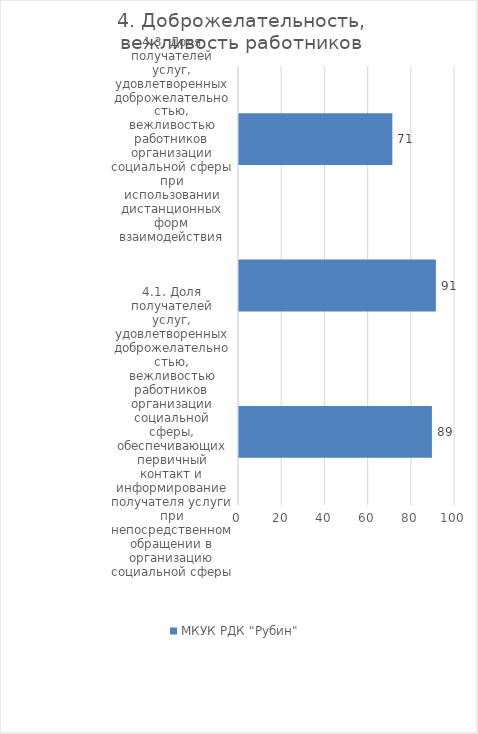
| Category | МКУК РДК "Рубин"  |
|---|---|
| 4.1. Доля получателей услуг, удовлетворенных доброжелательностью, вежливостью работников организации социальной сферы, обеспечивающих первичный контакт и информирование получателя услуги при непосредственном обращении в организацию социальной сферы  | 89.313 |
| 4.2. Доля получателей услуг, удовлетворенных доброжелательностью, вежливостью работников организации социальной сферы, обеспечивающих непосредственное оказание услуги при обращении в организацию социальной сферы | 91.145 |
| 4.3. Доля получателей услуг, удовлетворенных доброжелательностью, вежливостью работников организации социальной сферы при использовании дистанционных форм взаимодействия | 70.992 |